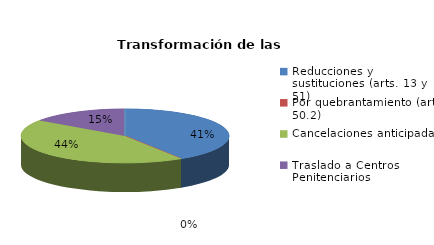
| Category | Series 0 |
|---|---|
| Reducciones y sustituciones (arts. 13 y 51) | 43 |
| Por quebrantamiento (art. 50.2) | 0 |
| Cancelaciones anticipadas | 46 |
| Traslado a Centros Penitenciarios | 16 |
| Conversión internamientos en cerrados (art. 51.2) | 0 |